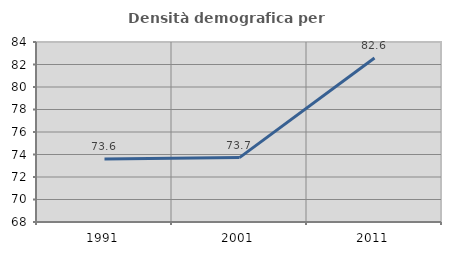
| Category | Densità demografica |
|---|---|
| 1991.0 | 73.591 |
| 2001.0 | 73.726 |
| 2011.0 | 82.575 |